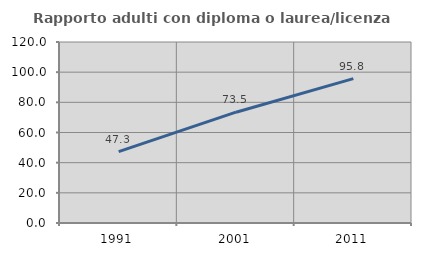
| Category | Rapporto adulti con diploma o laurea/licenza media  |
|---|---|
| 1991.0 | 47.289 |
| 2001.0 | 73.458 |
| 2011.0 | 95.756 |